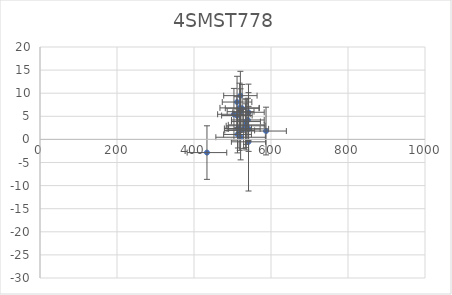
| Category | 4SMST778 |
|---|---|
| 525.087398297572 | 6.736 |
| 511.35651804932945 | 5.16 |
| 514.1052244212943 | 2.371 |
| 521.0672420410974 | 0.468 |
| 513.0266146330613 | 1.074 |
| 520.4698380678986 | 9.472 |
| 534.8763894176367 | 3.858 |
| 535.729643173187 | 3.141 |
| 534.1576106986108 | 2.951 |
| 511.84821470883185 | 8.088 |
| 541.5725053304037 | -0.525 |
| 539.9571219933449 | 4.205 |
| 518.5392384832248 | 6.823 |
| 503.6952673816345 | 5.436 |
| 433.65820106771065 | -2.854 |
| 541.4872017627634 | 5.871 |
| 587.0962577402826 | 1.808 |
| 521.0222341092938 | 6.002 |
| 518.7205729237778 | 1.937 |
| 528.8258418736278 | 2.253 |
| 541.8632297968501 | 2.278 |